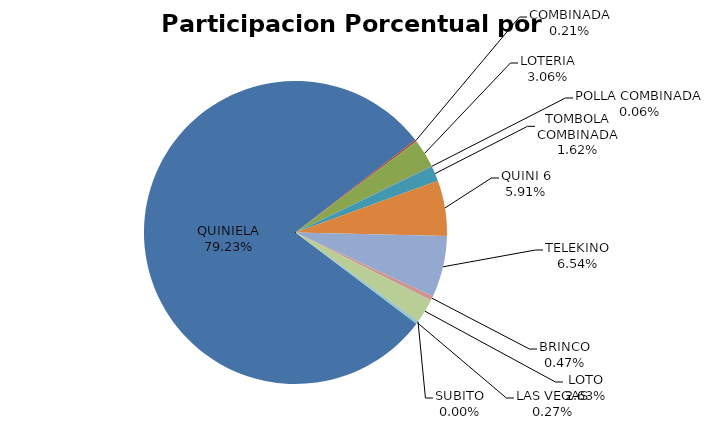
| Category | Series 0 |
|---|---|
| QUINIELA | 21001007.34 |
| COMBINADA | 55731.6 |
| LOTERIA | 811080 |
| POLLA COMBINADA | 15574.5 |
| TOMBOLA COMBINADA | 428426.4 |
| QUINI 6 | 1566947.2 |
| TELEKINO | 1733618.7 |
| BRINCO | 125157.6 |
| LOTO | 697842.75 |
| SUBITO | 0 |
| LAS VEGAS | 71424.75 |